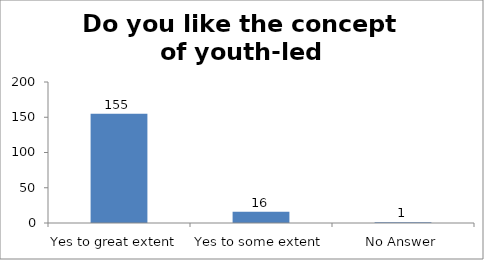
| Category | Do you like the concept of youth-led Changemaking?  |
|---|---|
| Yes to great extent  | 155 |
| Yes to some extent | 16 |
| No Answer | 1 |